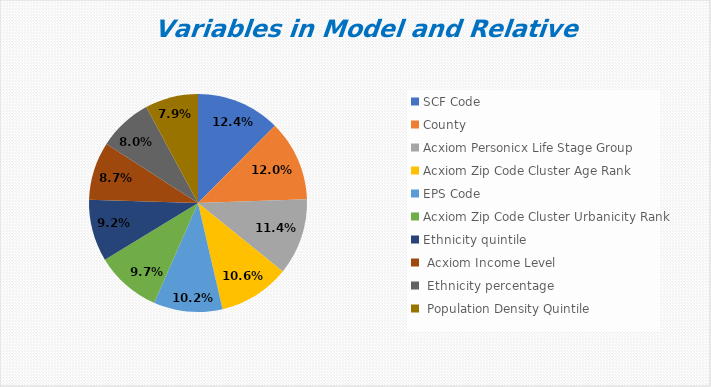
| Category | Series 0 |
|---|---|
| SCF Code | 0.124 |
| County | 0.12 |
| Acxiom Personicx Life Stage Group | 0.113 |
| Acxiom Zip Code Cluster Age Rank | 0.106 |
| EPS Code | 0.102 |
| Acxiom Zip Code Cluster Urbanicity Rank | 0.097 |
| Ethnicity quintile | 0.092 |
|  Acxiom Income Level  | 0.087 |
|  Ethnicity percentage  | 0.08 |
|  Population Density Quintile  | 0.079 |